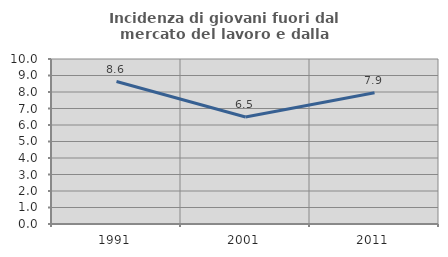
| Category | Incidenza di giovani fuori dal mercato del lavoro e dalla formazione  |
|---|---|
| 1991.0 | 8.634 |
| 2001.0 | 6.485 |
| 2011.0 | 7.949 |